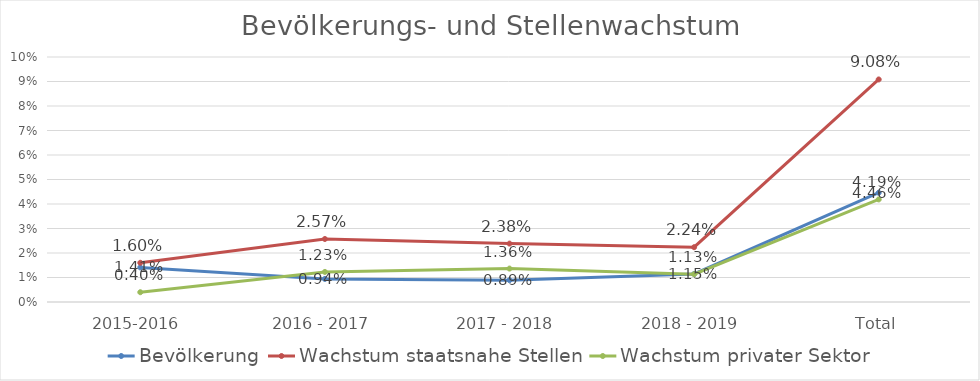
| Category | Bevölkerung | Wachstum staatsnahe Stellen | Wachstum privater Sektor |
|---|---|---|---|
| 2015-2016 | 0.014 | 0.016 | 0.004 |
| 2016 - 2017 | 0.009 | 0.026 | 0.012 |
| 2017 - 2018 | 0.009 | 0.024 | 0.014 |
| 2018 - 2019 | 0.011 | 0.022 | 0.011 |
| Total | 0.045 | 0.091 | 0.042 |